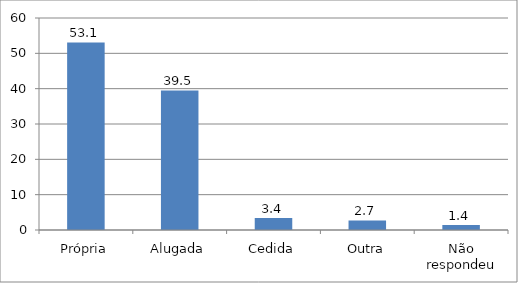
| Category | Series 0 |
|---|---|
| Própria | 53.1 |
| Alugada | 39.5 |
| Cedida | 3.4 |
| Outra | 2.7 |
| Não respondeu | 1.4 |